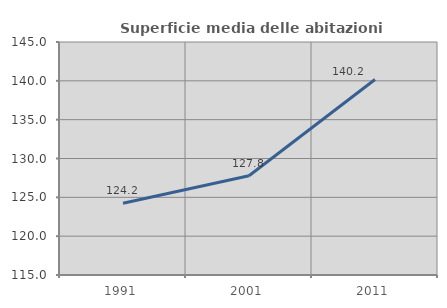
| Category | Superficie media delle abitazioni occupate |
|---|---|
| 1991.0 | 124.244 |
| 2001.0 | 127.776 |
| 2011.0 | 140.166 |